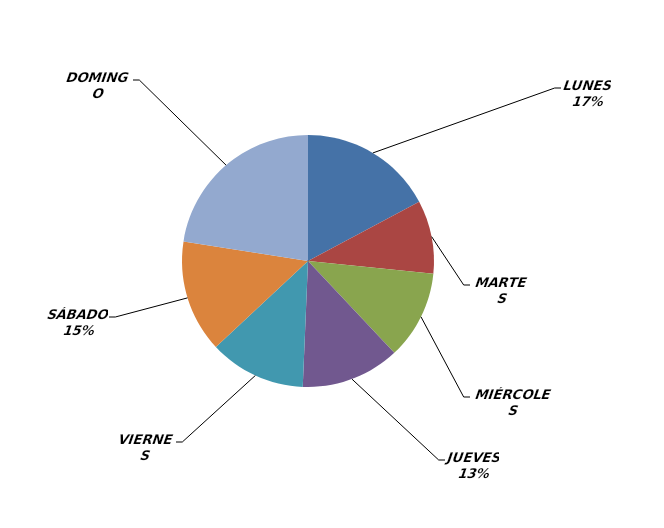
| Category | Series 0 |
|---|---|
| LUNES | 311 |
| MARTES | 170 |
| MIÉRCOLES | 206 |
| JUEVES | 229 |
| VIERNES | 224 |
| SÁBADO | 261 |
| DOMINGO | 407 |